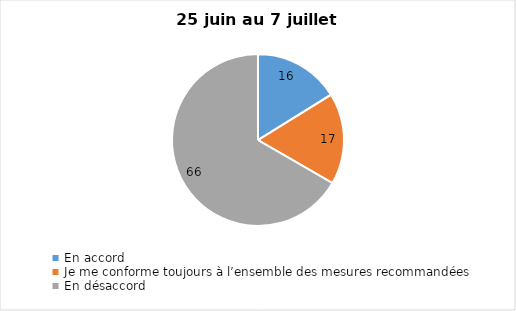
| Category | Series 0 |
|---|---|
| En accord | 16 |
| Je me conforme toujours à l’ensemble des mesures recommandées | 17 |
| En désaccord | 66 |